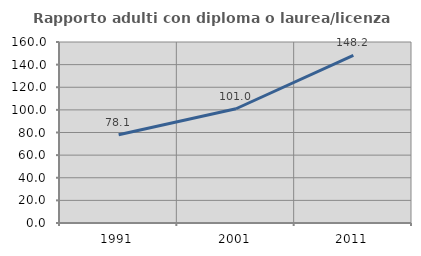
| Category | Rapporto adulti con diploma o laurea/licenza media  |
|---|---|
| 1991.0 | 78.07 |
| 2001.0 | 100.99 |
| 2011.0 | 148.227 |